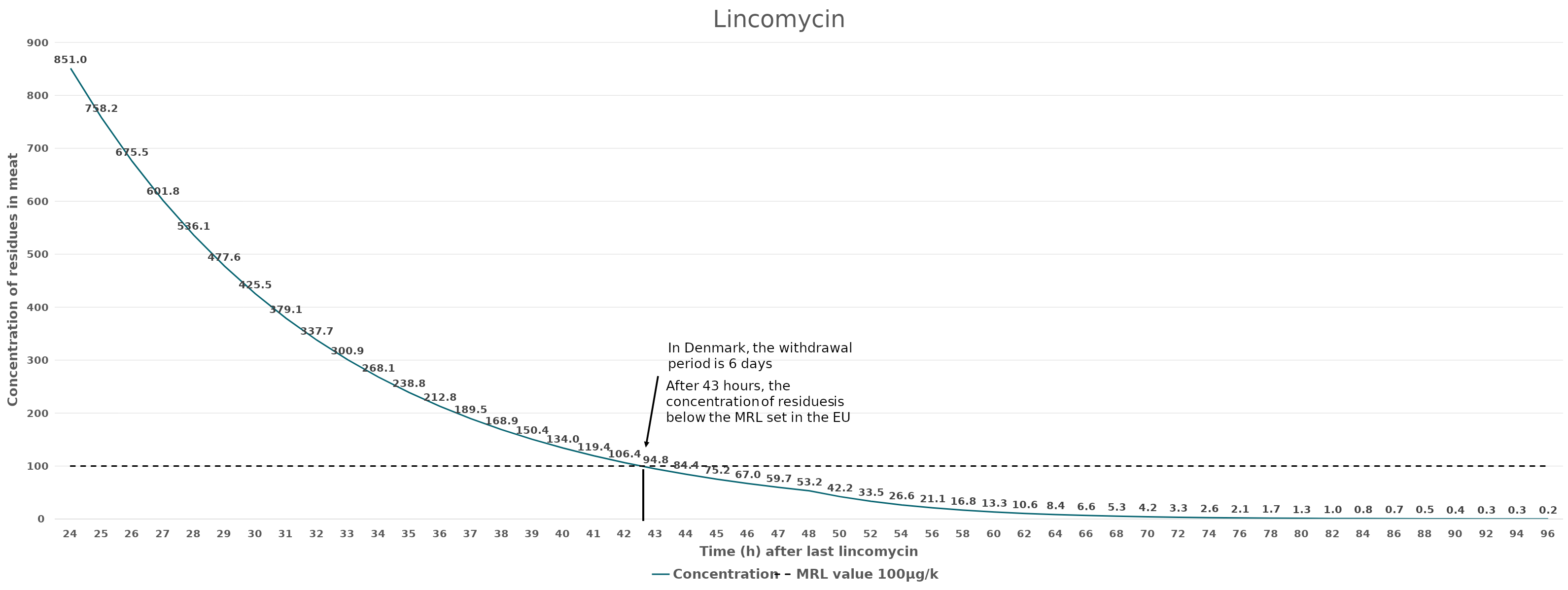
| Category | Concentration | MRL value 100μg/kg |
|---|---|---|
| 24.0 | 851.035 | 100 |
| 25.0 | 758.186 | 100 |
| 26.0 | 675.467 | 100 |
| 27.0 | 601.773 | 100 |
| 28.0 | 536.118 | 100 |
| 29.0 | 477.627 | 100 |
| 30.0 | 425.517 | 100 |
| 31.0 | 379.093 | 100 |
| 32.0 | 337.733 | 100 |
| 33.0 | 300.886 | 100 |
| 34.0 | 268.059 | 100 |
| 35.0 | 238.814 | 100 |
| 36.0 | 212.759 | 100 |
| 37.0 | 189.546 | 100 |
| 38.0 | 168.867 | 100 |
| 39.0 | 150.443 | 100 |
| 40.0 | 134.03 | 100 |
| 41.0 | 119.407 | 100 |
| 42.0 | 106.379 | 100 |
| 43.0 | 94.773 | 100 |
| 44.0 | 84.433 | 100 |
| 45.0 | 75.222 | 100 |
| 46.0 | 67.015 | 100 |
| 47.0 | 59.703 | 100 |
| 48.0 | 53.19 | 100 |
| 50.0 | 42.217 | 100 |
| 52.0 | 33.507 | 100 |
| 54.0 | 26.595 | 100 |
| 56.0 | 21.108 | 100 |
| 58.0 | 16.754 | 100 |
| 60.0 | 13.297 | 100 |
| 62.0 | 10.554 | 100 |
| 64.0 | 8.377 | 100 |
| 66.0 | 6.649 | 100 |
| 68.0 | 5.277 | 100 |
| 70.0 | 4.188 | 100 |
| 72.0 | 3.324 | 100 |
| 74.0 | 2.639 | 100 |
| 76.0 | 2.094 | 100 |
| 78.0 | 1.662 | 100 |
| 80.0 | 1.319 | 100 |
| 82.0 | 1.047 | 100 |
| 84.0 | 0.831 | 100 |
| 86.0 | 0.66 | 100 |
| 88.0 | 0.524 | 100 |
| 90.0 | 0.416 | 100 |
| 92.0 | 0.33 | 100 |
| 94.0 | 0.262 | 100 |
| 96.0 | 0.208 | 100 |